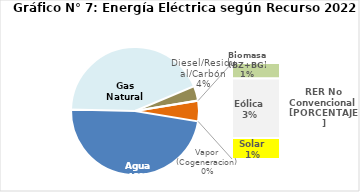
| Category | Series 0 |
|---|---|
| Agua | 2309.401 |
| Gas Natural | 2091.831 |
| Diesel/Residual/Carbón | 180.52 |
| Vapor (Cogeneracion) | 0.117 |
| Biomasa (BZ+BG) | 40.92 |
| Eólica | 155.893 |
| Solar | 55.024 |